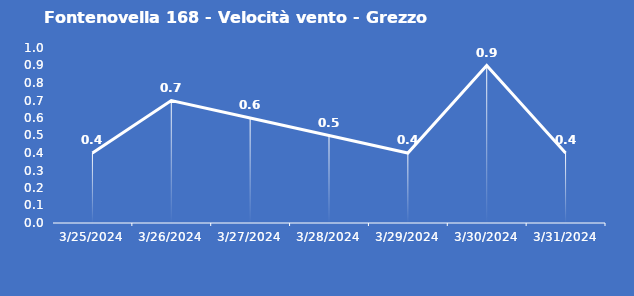
| Category | Fontenovella 168 - Velocità vento - Grezzo (m/s) |
|---|---|
| 3/25/24 | 0.4 |
| 3/26/24 | 0.7 |
| 3/27/24 | 0.6 |
| 3/28/24 | 0.5 |
| 3/29/24 | 0.4 |
| 3/30/24 | 0.9 |
| 3/31/24 | 0.4 |